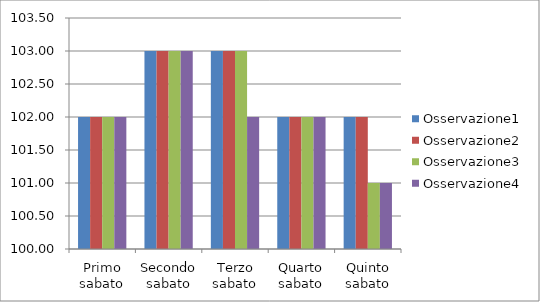
| Category | Osservazione1 | Osservazione2 | Osservazione3 | Osservazione4 |
|---|---|---|---|---|
| Primo sabato | 102 | 102 | 102 | 102 |
| Secondo sabato | 103 | 103 | 103 | 103 |
| Terzo sabato | 103 | 103 | 103 | 102 |
| Quarto sabato | 102 | 102 | 102 | 102 |
| Quinto sabato | 102 | 102 | 101 | 101 |